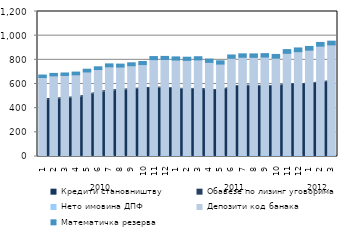
| Category | Нето имовина ДПФ | Депозити код банака | Математичка резерва |
|---|---|---|---|
| 0 | 7.432 | 646.511 | 20.312 |
| 1900-01-01 | 7.676 | 659.663 | 20.312 |
| 1900-01-02 | 7.899 | 662.954 | 20.312 |
| 1900-01-03 | 8.15 | 667.87 | 22.604 |
| 1900-01-04 | 8.327 | 691.436 | 22.604 |
| 1900-01-05 | 8.568 | 711.137 | 22.604 |
| 1900-01-06 | 8.841 | 733.466 | 24.18 |
| 1900-01-07 | 8.995 | 731.517 | 24.18 |
| 1900-01-08 | 9.206 | 742.22 | 24.18 |
| 1900-01-09 | 9.488 | 751.29 | 25.593 |
| 1900-01-10 | 9.639 | 791.893 | 25.593 |
| 1900-01-11 | 9.863 | 792.868 | 25.593 |
| 1900-01-12 | 10.082 | 788.106 | 26.141 |
| 1900-01-13 | 10.238 | 785.305 | 26.141 |
| 1900-01-14 | 10.435 | 789.147 | 26.141 |
| 1900-01-15 | 10.51 | 768.585 | 27.221 |
| 1900-01-16 | 10.725 | 754.058 | 27.221 |
| 1900-01-17 | 11.067 | 802.026 | 27.221 |
| 1900-01-18 | 11.306 | 810.237 | 27.991 |
| 1900-01-19 | 11.45 | 809.643 | 27.991 |
| 1900-01-20 | 11.587 | 811.769 | 27.991 |
| 1900-01-21 | 11.853 | 801.997 | 30.667 |
| 1900-01-22 | 12.123 | 841.906 | 30.667 |
| 1900-01-23 | 12.452 | 855.201 | 30.667 |
| 1900-01-24 | 12.722 | 867.345 | 30.667 |
| 1900-01-25 | 13.086 | 900.268 | 30.667 |
| 1900-01-26 | 13.424 | 910.443 | 30.667 |